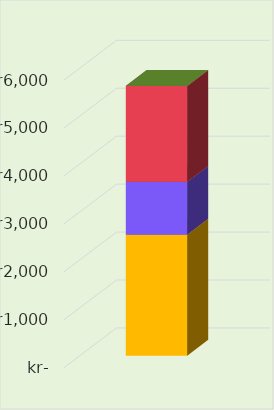
| Category | Series 3 | Series 4 | Series 2 | Series 1 | Series 0 |
|---|---|---|---|---|---|
| 0 | 2525 | 1103.162 | 0 | 2000 | 0 |